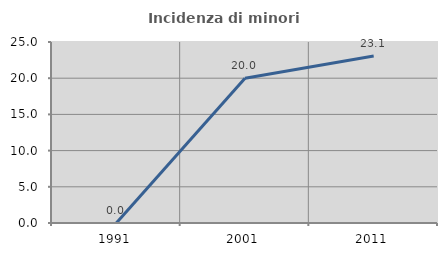
| Category | Incidenza di minori stranieri |
|---|---|
| 1991.0 | 0 |
| 2001.0 | 20 |
| 2011.0 | 23.077 |